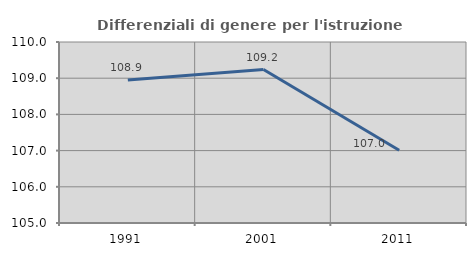
| Category | Differenziali di genere per l'istruzione superiore |
|---|---|
| 1991.0 | 108.948 |
| 2001.0 | 109.24 |
| 2011.0 | 107.011 |